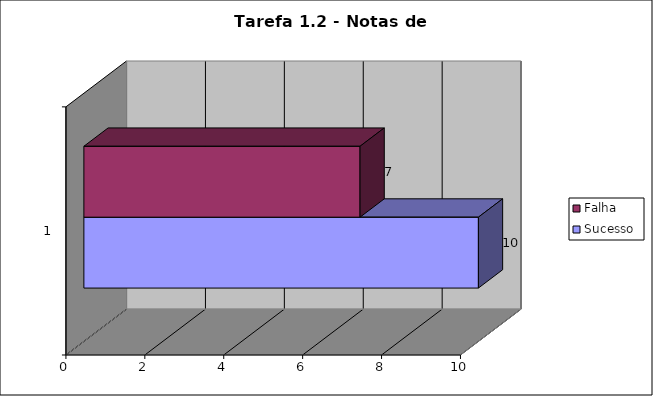
| Category | Sucesso | Falha |
|---|---|---|
| 0 | 10 | 7 |